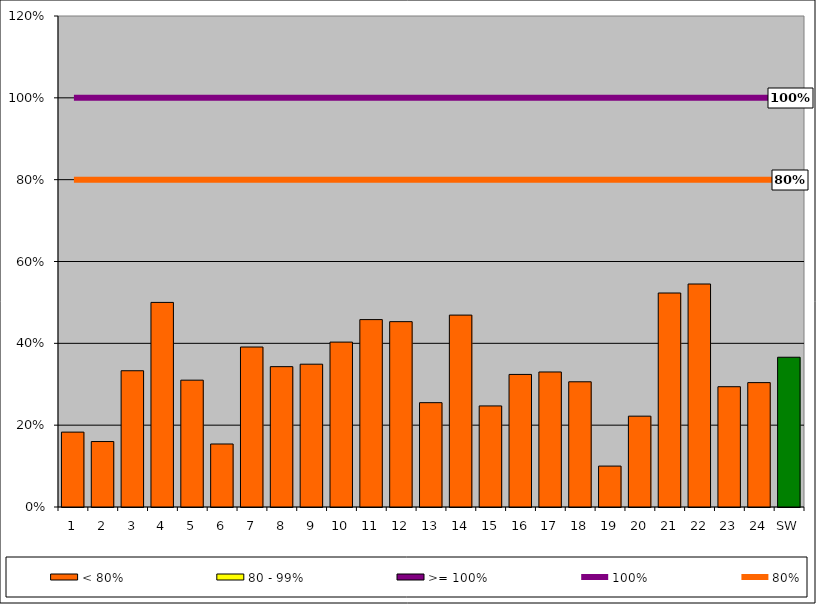
| Category | < 80% | 80 - 99% | >= 100% |
|---|---|---|---|
| 1 | 0.183 | 0 | 0 |
| 2 | 0.16 | 0 | 0 |
| 3 | 0.333 | 0 | 0 |
| 4 | 0.5 | 0 | 0 |
| 5 | 0.31 | 0 | 0 |
| 6 | 0.154 | 0 | 0 |
| 7 | 0.391 | 0 | 0 |
| 8 | 0.343 | 0 | 0 |
| 9 | 0.349 | 0 | 0 |
| 10 | 0.403 | 0 | 0 |
| 11 | 0.458 | 0 | 0 |
| 12 | 0.453 | 0 | 0 |
| 13 | 0.255 | 0 | 0 |
| 14 | 0.469 | 0 | 0 |
| 15 | 0.247 | 0 | 0 |
| 16 | 0.324 | 0 | 0 |
| 17 | 0.33 | 0 | 0 |
| 18 | 0.306 | 0 | 0 |
| 19 | 0.1 | 0 | 0 |
| 20 | 0.222 | 0 | 0 |
| 21 | 0.523 | 0 | 0 |
| 22 | 0.545 | 0 | 0 |
| 23 | 0.294 | 0 | 0 |
| 24 | 0.304 | 0 | 0 |
| SW | 0.366 | 0 | 0 |